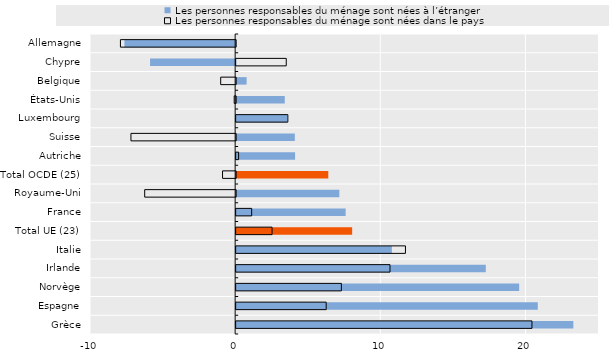
| Category | Les personnes responsables du ménage sont nées à l’étranger | Les personnes responsables du ménage sont nées dans le pays |
|---|---|---|
| Allemagne | -7.63 | -7.938 |
| Chypre | -5.861 | 3.453 |
| Belgique | 0.722 | -1.03 |
| États-Unis | 3.35 | -0.1 |
| Luxembourg | 3.508 | 3.563 |
| Suisse | 4.043 | -7.214 |
| Autriche | 4.06 | 0.169 |
| Total OCDE (25) | 6.348 | -0.903 |
| Royaume-Uni | 7.11 | -6.266 |
| France | 7.545 | 1.07 |
| Total UE (23) | 7.994 | 2.475 |
| Italie | 10.73 | 11.664 |
| Irlande | 17.2 | 10.6 |
| Norvège | 19.5 | 7.25 |
| Espagne | 20.783 | 6.204 |
| Grèce | 23.232 | 20.38 |